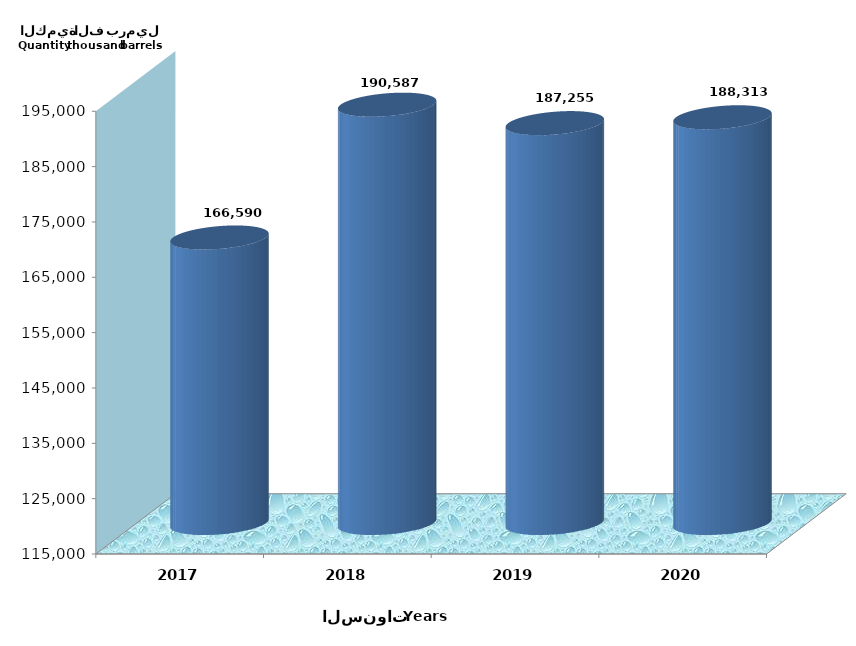
| Category | Series 0 |
|---|---|
| 2017 | 166590059.344 |
| 2018 | 190586727.136 |
| 2019 | 187255134.955 |
| 2020 | 188313351.994 |